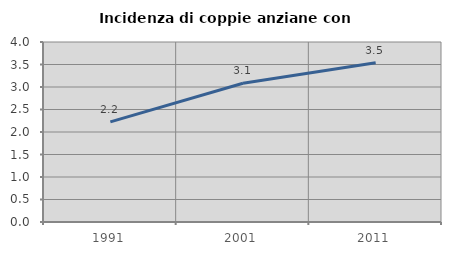
| Category | Incidenza di coppie anziane con figli |
|---|---|
| 1991.0 | 2.226 |
| 2001.0 | 3.084 |
| 2011.0 | 3.54 |